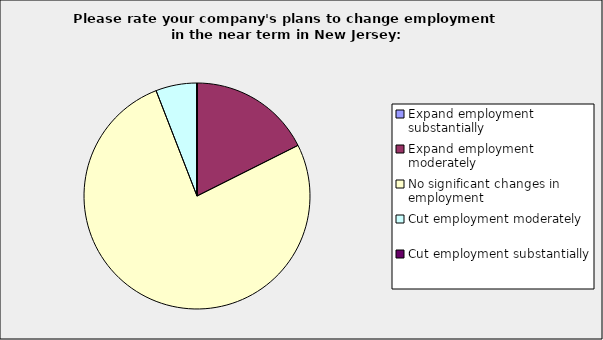
| Category | Series 0 |
|---|---|
| Expand employment substantially | 0 |
| Expand employment moderately | 0.176 |
| No significant changes in employment | 0.765 |
| Cut employment moderately | 0.059 |
| Cut employment substantially | 0 |